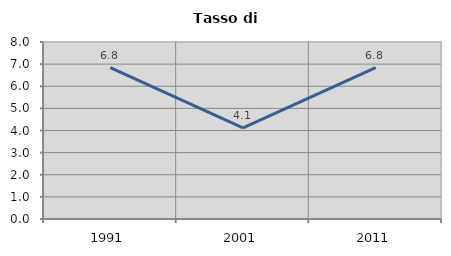
| Category | Tasso di disoccupazione   |
|---|---|
| 1991.0 | 6.837 |
| 2001.0 | 4.118 |
| 2011.0 | 6.844 |